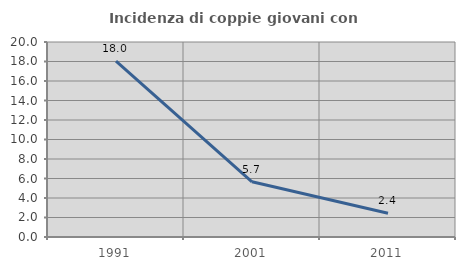
| Category | Incidenza di coppie giovani con figli |
|---|---|
| 1991.0 | 18.033 |
| 2001.0 | 5.66 |
| 2011.0 | 2.439 |